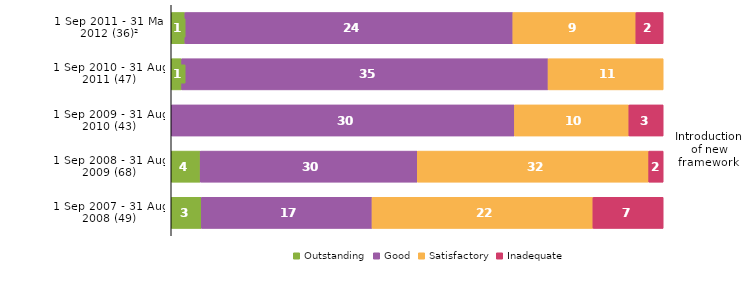
| Category | Outstanding | Good | Satisfactory | Inadequate |
|---|---|---|---|---|
| 1 Sep 2011 - 31 Mar 2012 (36)² | 1 | 24 | 9 | 2 |
| 1 Sep 2010 - 31 Aug 2011 (47) | 1 | 35 | 11 | 0 |
| 1 Sep 2009 - 31 Aug 2010 (43) | 0 | 30 | 10 | 3 |
| 1 Sep 2008 - 31 Aug 2009 (68) | 4 | 30 | 32 | 2 |
| 1 Sep 2007 - 31 Aug 2008 (49) | 3 | 17 | 22 | 7 |